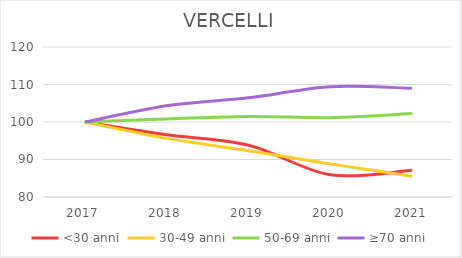
| Category | <30 anni | 30-49 anni | 50-69 anni | ≥70 anni |
|---|---|---|---|---|
| 2017.0 | 100 | 100 | 100 | 100 |
| 2018.0 | 96.594 | 95.63 | 100.79 | 104.329 |
| 2019.0 | 93.808 | 92.348 | 101.489 | 106.452 |
| 2020.0 | 85.913 | 88.794 | 101.158 | 109.423 |
| 2021.0 | 87.152 | 85.553 | 102.243 | 108.998 |